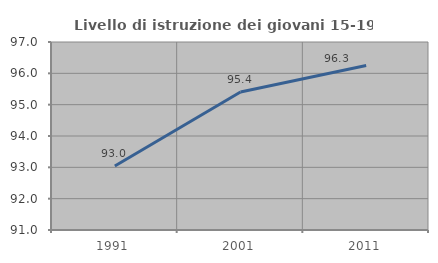
| Category | Livello di istruzione dei giovani 15-19 anni |
|---|---|
| 1991.0 | 93.043 |
| 2001.0 | 95.402 |
| 2011.0 | 96.25 |